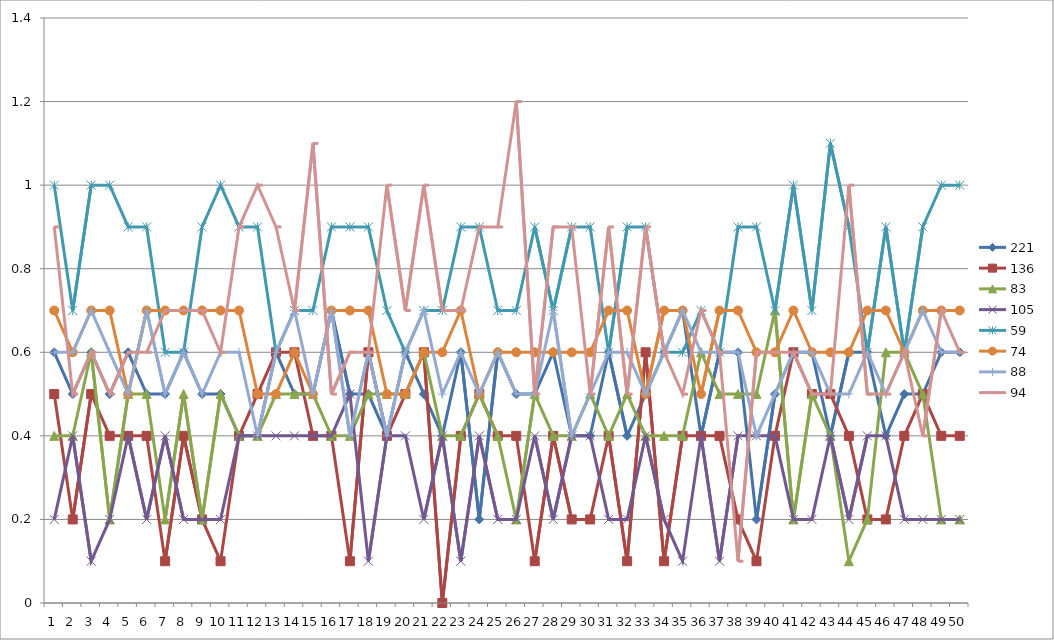
| Category | 221 | 136 | 83 | 105 | 59 | 74 | 88 | 94 |
|---|---|---|---|---|---|---|---|---|
| 0 | 0.6 | 0.5 | 0.4 | 0.2 | 1 | 0.7 | 0.6 | 0.9 |
| 1 | 0.5 | 0.2 | 0.4 | 0.4 | 0.7 | 0.6 | 0.6 | 0.5 |
| 2 | 0.6 | 0.5 | 0.6 | 0.1 | 1 | 0.7 | 0.7 | 0.6 |
| 3 | 0.5 | 0.4 | 0.2 | 0.2 | 1 | 0.7 | 0.6 | 0.5 |
| 4 | 0.6 | 0.4 | 0.5 | 0.4 | 0.9 | 0.5 | 0.5 | 0.6 |
| 5 | 0.5 | 0.4 | 0.5 | 0.2 | 0.9 | 0.7 | 0.7 | 0.6 |
| 6 | 0.5 | 0.1 | 0.2 | 0.4 | 0.6 | 0.7 | 0.5 | 0.7 |
| 7 | 0.6 | 0.4 | 0.5 | 0.2 | 0.6 | 0.7 | 0.6 | 0.7 |
| 8 | 0.5 | 0.2 | 0.2 | 0.2 | 0.9 | 0.7 | 0.5 | 0.7 |
| 9 | 0.5 | 0.1 | 0.5 | 0.2 | 1 | 0.7 | 0.6 | 0.6 |
| 10 | 0.4 | 0.4 | 0.4 | 0.4 | 0.9 | 0.7 | 0.6 | 0.9 |
| 11 | 0.4 | 0.5 | 0.4 | 0.4 | 0.9 | 0.5 | 0.4 | 1 |
| 12 | 0.6 | 0.6 | 0.5 | 0.4 | 0.6 | 0.5 | 0.6 | 0.9 |
| 13 | 0.5 | 0.6 | 0.5 | 0.4 | 0.7 | 0.6 | 0.7 | 0.7 |
| 14 | 0.5 | 0.4 | 0.5 | 0.4 | 0.7 | 0.5 | 0.5 | 1.1 |
| 15 | 0.7 | 0.4 | 0.4 | 0.4 | 0.9 | 0.7 | 0.7 | 0.5 |
| 16 | 0.5 | 0.1 | 0.4 | 0.5 | 0.9 | 0.7 | 0.4 | 0.6 |
| 17 | 0.5 | 0.6 | 0.5 | 0.1 | 0.9 | 0.7 | 0.6 | 0.6 |
| 18 | 0.4 | 0.4 | 0.5 | 0.4 | 0.7 | 0.5 | 0.4 | 1 |
| 19 | 0.6 | 0.5 | 0.5 | 0.4 | 0.6 | 0.5 | 0.6 | 0.7 |
| 20 | 0.5 | 0.6 | 0.6 | 0.2 | 0.7 | 0.6 | 0.7 | 1 |
| 21 | 0.4 | 0 | 0.4 | 0.4 | 0.7 | 0.6 | 0.5 | 0.7 |
| 22 | 0.6 | 0.4 | 0.4 | 0.1 | 0.9 | 0.7 | 0.6 | 0.7 |
| 23 | 0.2 | 0.5 | 0.5 | 0.4 | 0.9 | 0.5 | 0.5 | 0.9 |
| 24 | 0.6 | 0.4 | 0.4 | 0.2 | 0.7 | 0.6 | 0.6 | 0.9 |
| 25 | 0.5 | 0.4 | 0.2 | 0.2 | 0.7 | 0.6 | 0.5 | 1.2 |
| 26 | 0.5 | 0.1 | 0.5 | 0.4 | 0.9 | 0.6 | 0.5 | 0.5 |
| 27 | 0.6 | 0.4 | 0.4 | 0.2 | 0.7 | 0.6 | 0.7 | 0.9 |
| 28 | 0.4 | 0.2 | 0.4 | 0.4 | 0.9 | 0.6 | 0.4 | 0.9 |
| 29 | 0.4 | 0.2 | 0.5 | 0.4 | 0.9 | 0.6 | 0.5 | 0.5 |
| 30 | 0.6 | 0.4 | 0.4 | 0.2 | 0.6 | 0.7 | 0.6 | 0.9 |
| 31 | 0.4 | 0.1 | 0.5 | 0.2 | 0.9 | 0.7 | 0.6 | 0.5 |
| 32 | 0.5 | 0.6 | 0.4 | 0.4 | 0.9 | 0.5 | 0.5 | 0.9 |
| 33 | 0.6 | 0.1 | 0.4 | 0.2 | 0.6 | 0.7 | 0.6 | 0.6 |
| 34 | 0.7 | 0.4 | 0.4 | 0.1 | 0.6 | 0.7 | 0.7 | 0.5 |
| 35 | 0.4 | 0.4 | 0.6 | 0.4 | 0.7 | 0.5 | 0.6 | 0.7 |
| 36 | 0.6 | 0.4 | 0.5 | 0.1 | 0.6 | 0.7 | 0.6 | 0.6 |
| 37 | 0.6 | 0.2 | 0.5 | 0.4 | 0.9 | 0.7 | 0.6 | 0.1 |
| 38 | 0.2 | 0.1 | 0.5 | 0.4 | 0.9 | 0.6 | 0.4 | 0.6 |
| 39 | 0.5 | 0.4 | 0.7 | 0.4 | 0.7 | 0.6 | 0.5 | 0.6 |
| 40 | 0.6 | 0.6 | 0.2 | 0.2 | 1 | 0.7 | 0.6 | 0.6 |
| 41 | 0.6 | 0.5 | 0.5 | 0.2 | 0.7 | 0.6 | 0.6 | 0.5 |
| 42 | 0.4 | 0.5 | 0.4 | 0.4 | 1.1 | 0.6 | 0.5 | 0.5 |
| 43 | 0.6 | 0.4 | 0.1 | 0.2 | 0.9 | 0.6 | 0.5 | 1 |
| 44 | 0.6 | 0.2 | 0.2 | 0.4 | 0.6 | 0.7 | 0.6 | 0.5 |
| 45 | 0.4 | 0.2 | 0.6 | 0.4 | 0.9 | 0.7 | 0.5 | 0.5 |
| 46 | 0.5 | 0.4 | 0.6 | 0.2 | 0.6 | 0.6 | 0.6 | 0.6 |
| 47 | 0.5 | 0.5 | 0.5 | 0.2 | 0.9 | 0.7 | 0.7 | 0.4 |
| 48 | 0.6 | 0.4 | 0.2 | 0.2 | 1 | 0.7 | 0.6 | 0.7 |
| 49 | 0.6 | 0.4 | 0.2 | 0.2 | 1 | 0.7 | 0.6 | 0.6 |